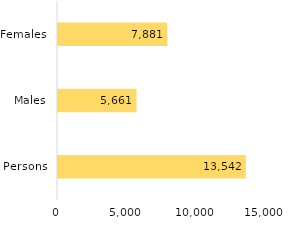
| Category | Series 0 |
|---|---|
| Persons | 13542 |
| Males | 5661 |
| Females | 7881 |